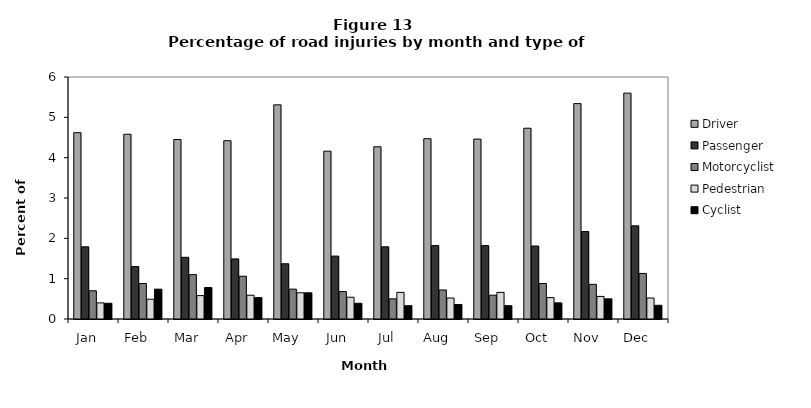
| Category | Driver | Passenger | Motorcyclist | Pedestrian | Cyclist |
|---|---|---|---|---|---|
| Jan   | 4.62 | 1.79 | 0.7 | 0.4 | 0.39 |
| Feb   | 4.58 | 1.3 | 0.88 | 0.49 | 0.74 |
| Mar   | 4.45 | 1.53 | 1.1 | 0.58 | 0.78 |
| Apr   | 4.42 | 1.49 | 1.06 | 0.59 | 0.53 |
| May   | 5.31 | 1.37 | 0.74 | 0.65 | 0.65 |
| Jun   | 4.16 | 1.56 | 0.68 | 0.54 | 0.39 |
| Jul   | 4.27 | 1.79 | 0.5 | 0.66 | 0.33 |
| Aug   | 4.47 | 1.82 | 0.72 | 0.52 | 0.36 |
| Sep   | 4.46 | 1.82 | 0.59 | 0.66 | 0.33 |
| Oct   | 4.73 | 1.81 | 0.88 | 0.53 | 0.4 |
| Nov   | 5.34 | 2.17 | 0.86 | 0.56 | 0.5 |
| Dec   | 5.6 | 2.31 | 1.13 | 0.52 | 0.34 |